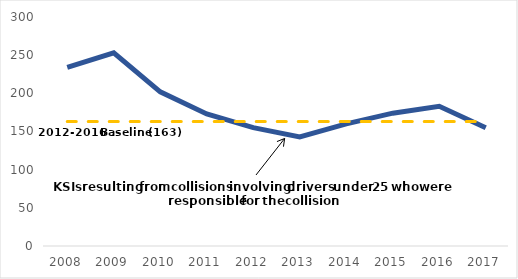
| Category | Series 0 | Series 1 |
|---|---|---|
| 2008 | 234 | 163 |
| 2009 | 253 | 163 |
| 2010 | 202 | 163 |
| 2011 | 173 | 163 |
| 2012 | 155 | 163 |
| 2013 | 143 | 163 |
| 2014 | 160 | 163 |
| 2015 | 174 | 163 |
| 2016 | 183 | 163 |
| 2017 | 155 | 163 |